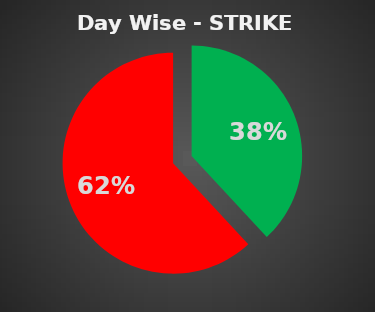
| Category | Series 0 |
|---|---|
| 0 | 0.381 |
| 1 | 0.619 |